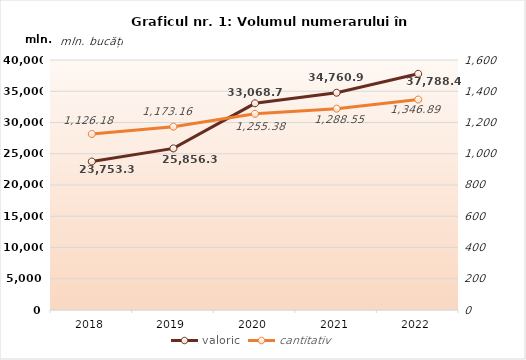
| Category | valoric |
|---|---|
| 2018 | 23753.32 |
| 2019 | 25856.34 |
| 2020 | 33068.73 |
| 2021 | 34760.96 |
| 2022 | 37788.43 |